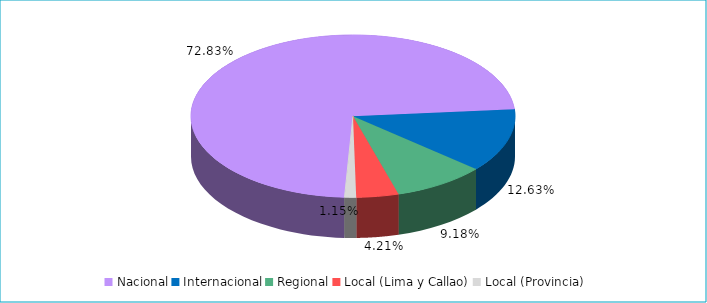
| Category | Series 0 |
|---|---|
| Nacional | 0.728 |
| Internacional | 0.126 |
| Regional | 0.092 |
| Local (Lima y Callao) | 0.042 |
| Local (Provincia) | 0.011 |